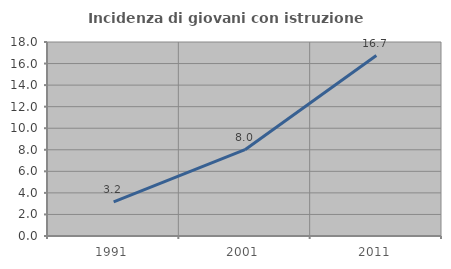
| Category | Incidenza di giovani con istruzione universitaria |
|---|---|
| 1991.0 | 3.168 |
| 2001.0 | 8.006 |
| 2011.0 | 16.74 |